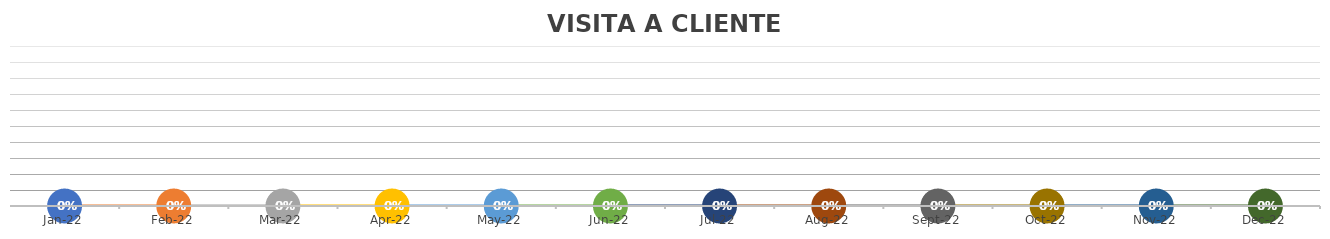
| Category | VISITA A CLIENTE POTENCIAL % |
|---|---|
| 2022-01-18 | 0 |
| 2022-02-18 | 0 |
| 2022-03-18 | 0 |
| 2022-04-18 | 0 |
| 2022-05-18 | 0 |
| 2022-06-18 | 0 |
| 2022-07-18 | 0 |
| 2022-08-18 | 0 |
| 2022-09-18 | 0 |
| 2022-10-18 | 0 |
| 2022-11-18 | 0 |
| 2022-12-18 | 0 |